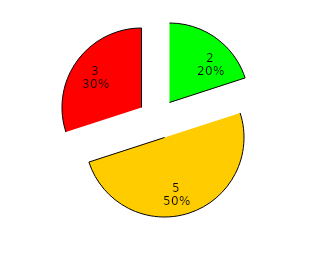
| Category | Series 0 |
|---|---|
| Aceitável | 2 |
| Tolerável | 5 |
| Inaceitavel | 3 |